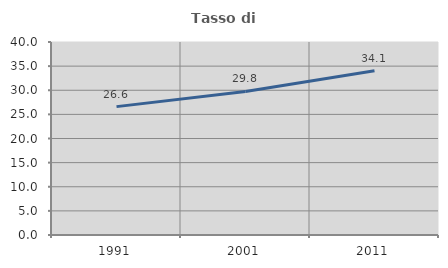
| Category | Tasso di occupazione   |
|---|---|
| 1991.0 | 26.605 |
| 2001.0 | 29.751 |
| 2011.0 | 34.053 |